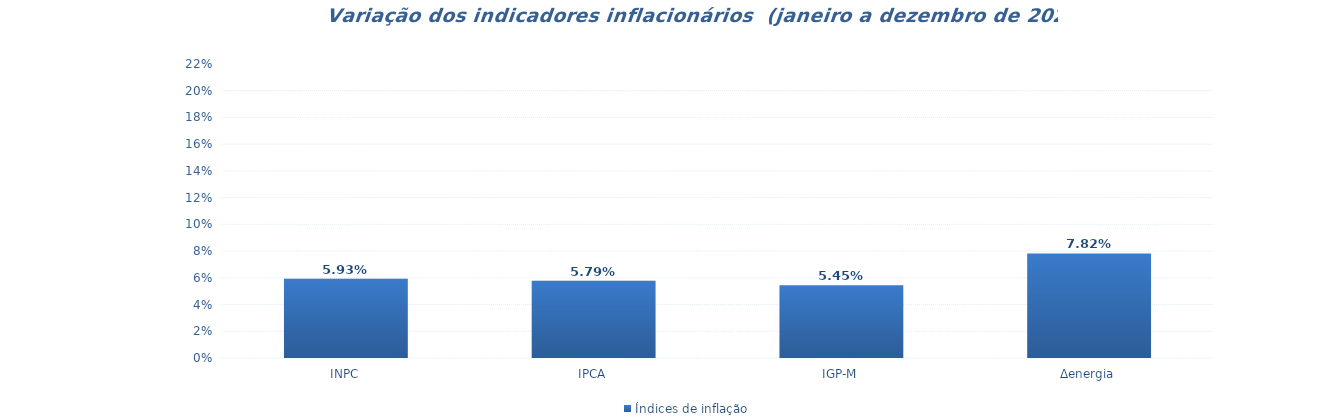
| Category | Índices de inflação |
|---|---|
| INPC | 0.059 |
| IPCA | 0.058 |
| IGP-M | 0.055 |
| Δenergia | 0.078 |